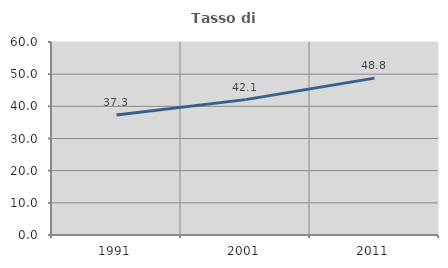
| Category | Tasso di occupazione   |
|---|---|
| 1991.0 | 37.276 |
| 2001.0 | 42.086 |
| 2011.0 | 48.767 |